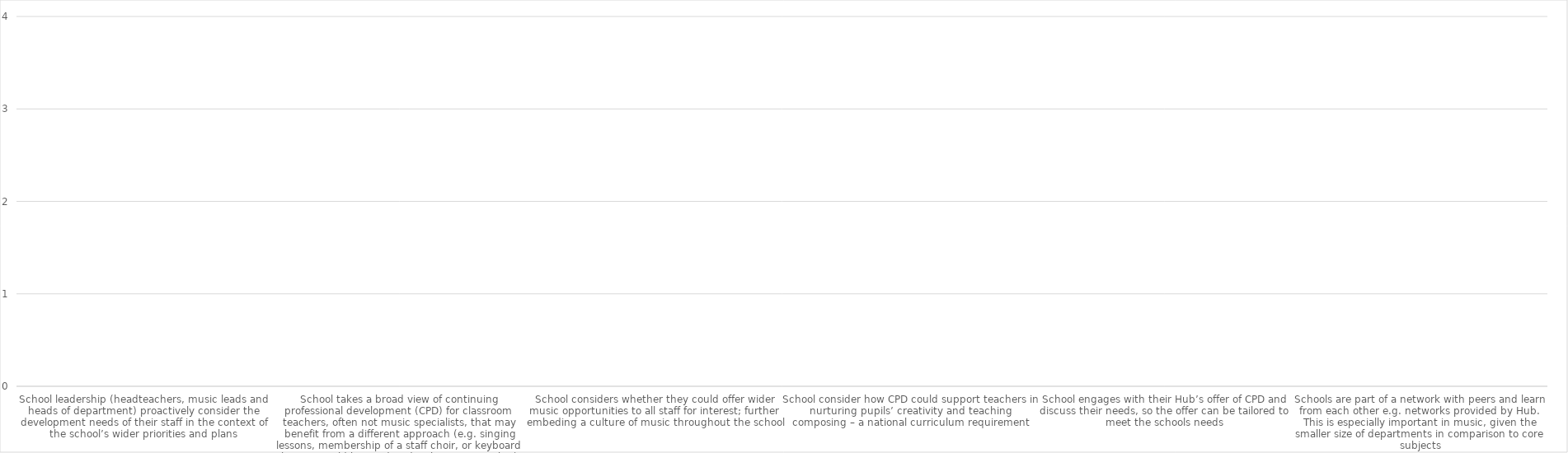
| Category | Series 0 |
|---|---|
| School leadership (headteachers, music leads and heads of department) proactively consider the development needs of their staff in the context of the school’s wider priorities and plans | 0 |
| School takes a broad view of continuing professional development (CPD) for classroom teachers, often not music specialists, that may benefit from a different approach (e.g. singing lessons, membership of a staff choir, or keyboard lessons could be used to  | 0 |
| School considers whether they could offer wider music opportunities to all staff for interest; further embeding a culture of music throughout the school | 0 |
| School consider how CPD could support teachers in nurturing pupils’ creativity and teaching composing – a national curriculum requirement | 0 |
| School engages with their Hub’s offer of CPD and discuss their needs, so the offer can be tailored to meet the schools needs | 0 |
| Schools are part of a network with peers and learn from each other e.g. networks provided by Hub.  This is especially important in music, given the smaller size of departments in comparison to core subjects | 0 |